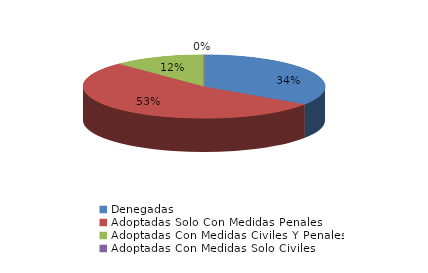
| Category | Series 0 |
|---|---|
| Denegadas | 42 |
| Adoptadas Solo Con Medidas Penales | 65 |
| Adoptadas Con Medidas Civiles Y Penales | 15 |
| Adoptadas Con Medidas Solo Civiles | 0 |